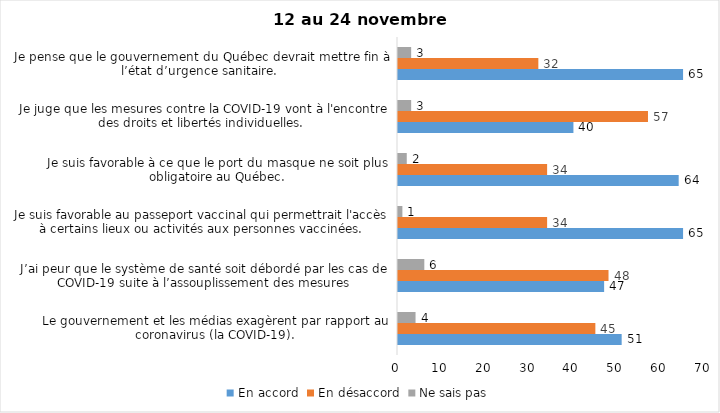
| Category | En accord | En désaccord | Ne sais pas |
|---|---|---|---|
| Le gouvernement et les médias exagèrent par rapport au coronavirus (la COVID-19). | 51 | 45 | 4 |
| J’ai peur que le système de santé soit débordé par les cas de COVID-19 suite à l’assouplissement des mesures | 47 | 48 | 6 |
| Je suis favorable au passeport vaccinal qui permettrait l'accès à certains lieux ou activités aux personnes vaccinées. | 65 | 34 | 1 |
| Je suis favorable à ce que le port du masque ne soit plus obligatoire au Québec. | 64 | 34 | 2 |
| Je juge que les mesures contre la COVID-19 vont à l'encontre des droits et libertés individuelles.  | 40 | 57 | 3 |
| Je pense que le gouvernement du Québec devrait mettre fin à l’état d’urgence sanitaire.  | 65 | 32 | 3 |